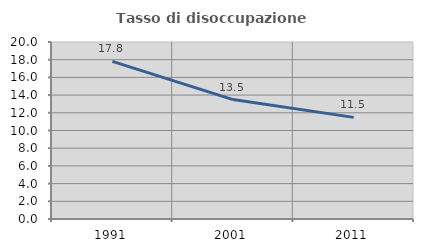
| Category | Tasso di disoccupazione giovanile  |
|---|---|
| 1991.0 | 17.811 |
| 2001.0 | 13.495 |
| 2011.0 | 11.483 |